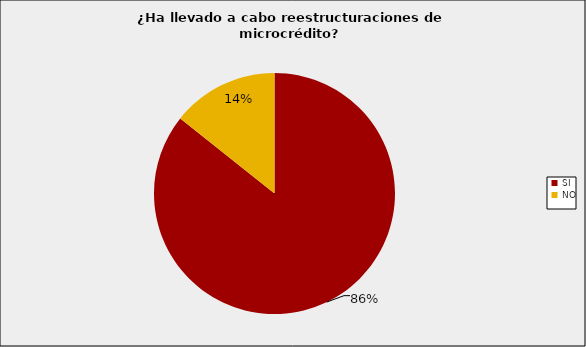
| Category | Entidades Supervisadas SFC |
|---|---|
| SI | 0.857 |
| NO | 0.143 |